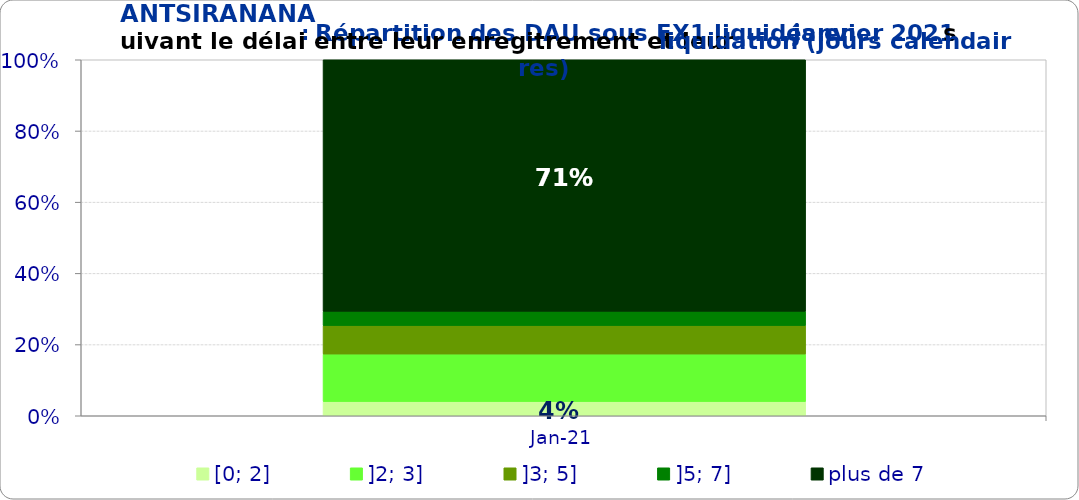
| Category | [0; 2] | ]2; 3] | ]3; 5] | ]5; 7] | plus de 7 |
|---|---|---|---|---|---|
| 2021-01-01 | 0.04 | 0.133 | 0.08 | 0.04 | 0.707 |